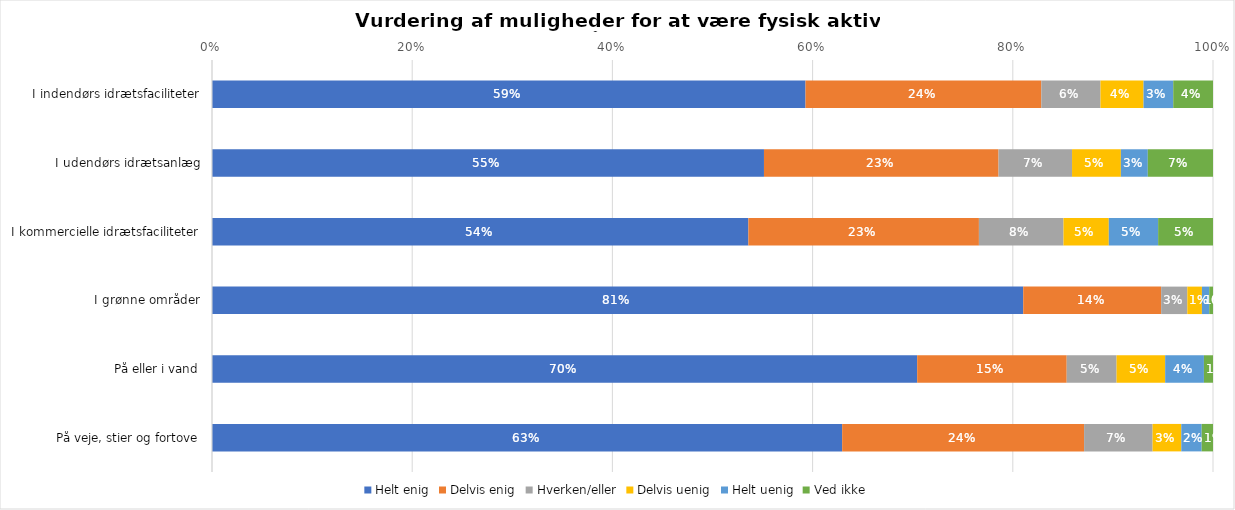
| Category | Helt enig | Delvis enig | Hverken/eller | Delvis uenig | Helt uenig | Ved ikke |
|---|---|---|---|---|---|---|
| I indendørs idrætsfaciliteter | 0.593 | 0.236 | 0.059 | 0.043 | 0.03 | 0.04 |
| I udendørs idrætsanlæg | 0.551 | 0.234 | 0.073 | 0.049 | 0.027 | 0.065 |
| I kommercielle idrætsfaciliteter | 0.536 | 0.23 | 0.084 | 0.045 | 0.049 | 0.055 |
| I grønne områder | 0.81 | 0.138 | 0.026 | 0.015 | 0.007 | 0.004 |
| På eller i vand | 0.704 | 0.149 | 0.05 | 0.049 | 0.039 | 0.009 |
| På veje, stier og fortove | 0.63 | 0.242 | 0.068 | 0.029 | 0.02 | 0.011 |